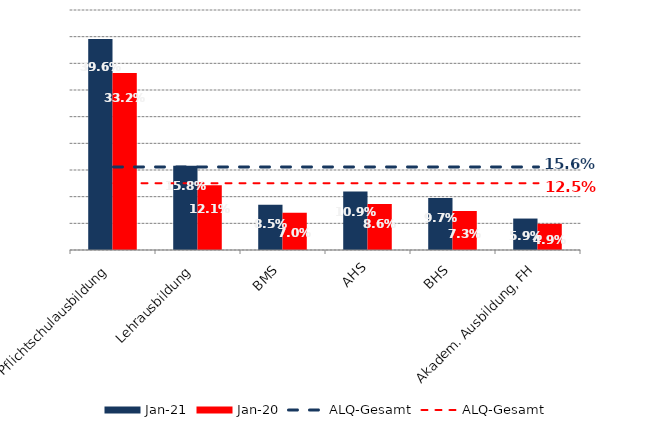
| Category | Jan 21 | Jan 20 |
|---|---|---|
| Pflichtschulausbildung | 0.396 | 0.332 |
| Lehrausbildung | 0.158 | 0.121 |
| BMS | 0.085 | 0.07 |
| AHS | 0.109 | 0.086 |
| BHS | 0.097 | 0.073 |
| Akadem. Ausbildung, FH | 0.059 | 0.049 |